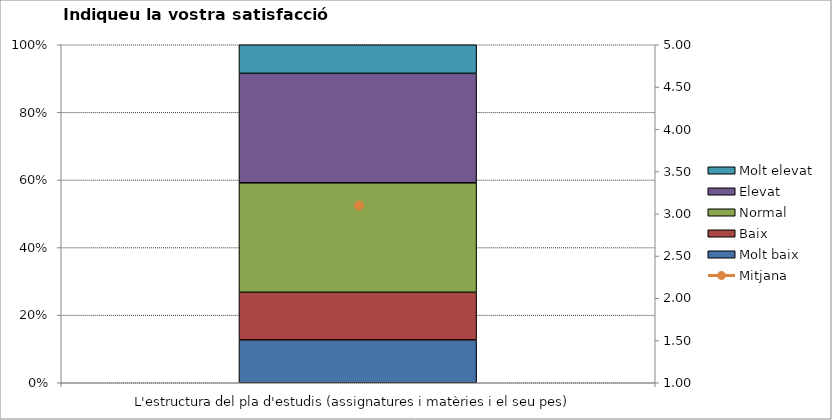
| Category | Molt baix | Baix | Normal  | Elevat | Molt elevat |
|---|---|---|---|---|---|
| L'estructura del pla d'estudis (assignatures i matèries i el seu pes) | 9 | 10 | 23 | 23 | 6 |